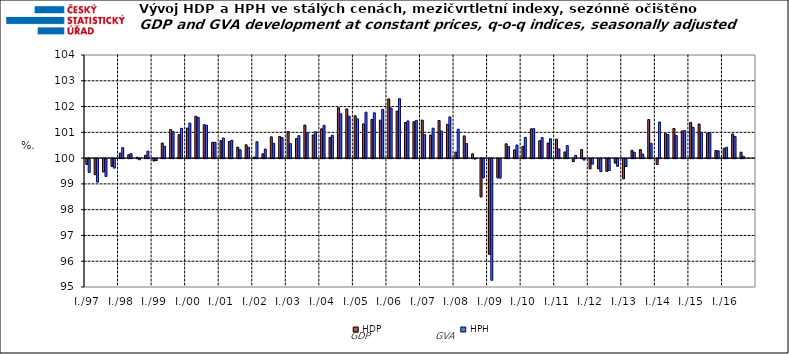
| Category | HDP

 | HPH

 |
|---|---|---|
| I./97 | 99.777 | 99.464 |
|  | 99.379 | 99.092 |
|  | 99.485 | 99.31 |
|  | 99.703 | 99.636 |
| I./98 | 100.194 | 100.406 |
|  | 100.133 | 100.173 |
|  | 100.033 | 99.958 |
|  | 100.107 | 100.271 |
| I./99 | 99.911 | 99.927 |
|  | 100.584 | 100.459 |
|  | 101.11 | 101.036 |
|  | 100.911 | 101.155 |
| I./00 | 101.165 | 101.358 |
|  | 101.626 | 101.58 |
|  | 101.295 | 101.277 |
|  | 100.611 | 100.614 |
| I./01 | 100.68 | 100.781 |
|  | 100.641 | 100.696 |
|  | 100.425 | 100.322 |
|  | 100.516 | 100.415 |
| I./02 | 100.042 | 100.634 |
|  | 100.166 | 100.353 |
|  | 100.826 | 100.573 |
|  | 100.841 | 100.795 |
| I./03 | 101.033 | 100.56 |
|  | 100.757 | 100.872 |
|  | 101.281 | 100.995 |
|  | 100.896 | 101.022 |
| I./04 | 101.137 | 101.274 |
|  | 100.805 | 100.886 |
|  | 101.955 | 101.717 |
|  | 101.909 | 101.627 |
| I./05 | 101.641 | 101.521 |
|  | 101.328 | 101.781 |
|  | 101.5 | 101.758 |
|  | 101.471 | 101.89 |
| I./06 | 102.296 | 101.947 |
|  | 101.825 | 102.303 |
|  | 101.38 | 101.444 |
|  | 101.411 | 101.463 |
| I./07 | 101.475 | 100.909 |
|  | 100.895 | 101.161 |
|  | 101.461 | 101.051 |
|  | 101.31 | 101.599 |
| I./08 | 100.233 | 101.122 |
|  | 100.863 | 100.563 |
|  | 100.164 | 99.983 |
|  | 98.517 | 99.255 |
| I./09 | 96.289 | 95.282 |
|  | 99.257 | 99.246 |
|  | 100.555 | 100.447 |
|  | 100.321 | 100.508 |
| I./10 | 100.452 | 100.804 |
|  | 101.136 | 101.142 |
|  | 100.675 | 100.801 |
|  | 100.584 | 100.752 |
| I./11 | 100.736 | 100.356 |
|  | 100.239 | 100.487 |
|  | 99.885 | 100.106 |
|  | 100.333 | 99.948 |
| I./12 | 99.607 | 99.789 |
|  | 99.61 | 99.497 |
|  | 99.51 | 99.539 |
|  | 99.83 | 99.703 |
| I./13 | 99.22 | 99.696 |
|  | 100.304 | 100.225 |
|  | 100.331 | 100.159 |
|  | 101.496 | 100.573 |
| I./14 | 99.776 | 101.401 |
|  | 100.952 | 100.914 |
|  | 101.152 | 100.877 |
|  | 101.055 | 101.069 |
| I./15 | 101.383 | 101.195 |
|  | 101.324 | 100.999 |
|  | 100.969 | 100.99 |
|  | 100.295 | 100.283 |
| I./16 | 100.383 | 100.421 |